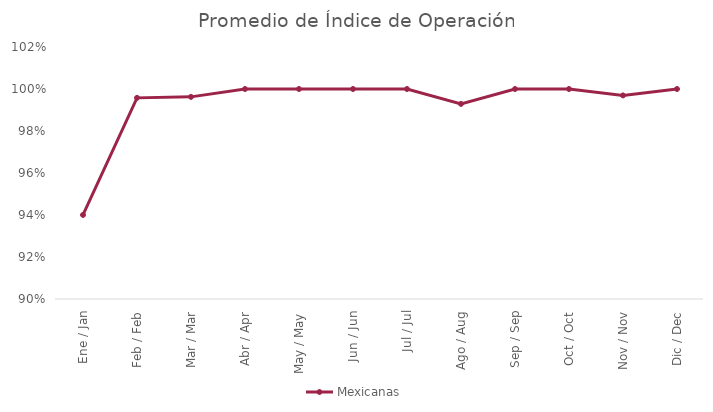
| Category | Mexicanas |
|---|---|
| Ene / Jan | 0.94 |
| Feb / Feb | 0.996 |
| Mar / Mar | 0.996 |
| Abr / Apr | 1 |
| May / May | 1 |
| Jun / Jun | 1 |
| Jul / Jul | 1 |
| Ago / Aug | 0.993 |
| Sep / Sep | 1 |
| Oct / Oct | 1 |
| Nov / Nov | 0.997 |
| Dic / Dec | 1 |